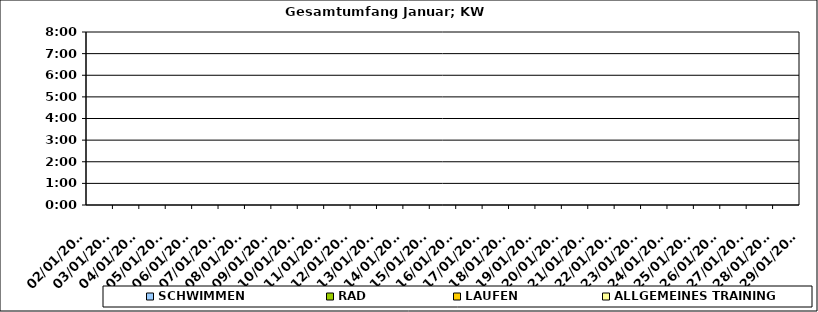
| Category | SCHWIMMEN | RAD | LAUFEN | ALLGEMEINES TRAINING |
|---|---|---|---|---|
| 02/01/2023 |  |  |  | 0 |
| 03/01/2023 |  |  |  | 0 |
| 04/01/2023 |  |  |  | 0 |
| 05/01/2023 |  |  |  | 0 |
| 06/01/2023 |  |  |  | 0 |
| 07/01/2023 |  |  |  | 0 |
| 08/01/2023 |  |  |  | 0 |
| 09/01/2023 |  |  |  | 0 |
| 10/01/2023 |  |  |  | 0 |
| 11/01/2023 |  |  |  | 0 |
| 12/01/2023 |  |  |  | 0 |
| 13/01/2023 |  |  |  | 0 |
| 14/01/2023 |  |  |  | 0 |
| 15/01/2023 |  |  |  | 0 |
| 16/01/2023 |  |  |  | 0 |
| 17/01/2023 |  |  |  | 0 |
| 18/01/2023 |  |  |  | 0 |
| 19/01/2023 |  |  |  | 0 |
| 20/01/2023 |  |  |  | 0 |
| 21/01/2023 |  |  |  | 0 |
| 22/01/2023 |  |  |  | 0 |
| 23/01/2023 |  |  |  | 0 |
| 24/01/2023 |  |  |  | 0 |
| 25/01/2023 |  |  |  | 0 |
| 26/01/2023 |  |  |  | 0 |
| 27/01/2023 |  |  |  | 0 |
| 28/01/2023 |  |  |  | 0 |
| 29/01/2023 |  |  |  | 0 |